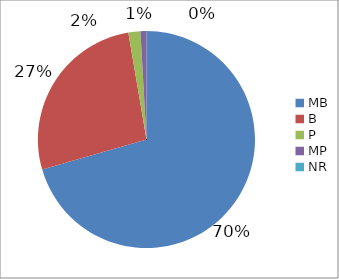
| Category | Series 0 |
|---|---|
| MB | 0.705 |
| B | 0.268 |
| P | 0.018 |
| MP | 0.009 |
| NR | 0 |